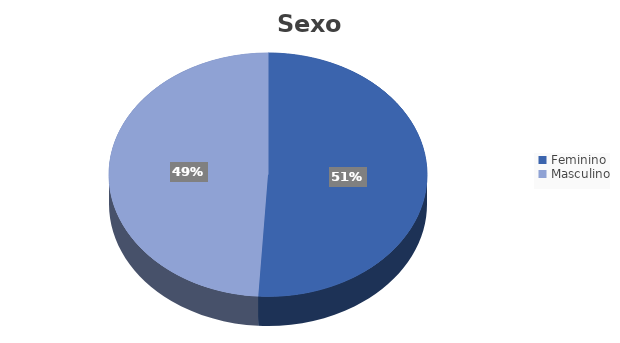
| Category | Series 0 |
|---|---|
| Feminino | 0.51 |
| Masculino | 0.49 |